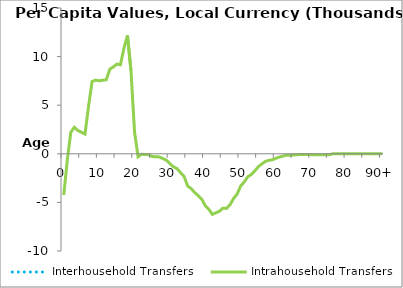
| Category | Interhousehold Transfers | Intrahousehold Transfers |
|---|---|---|
| 0 |  | -4239.979 |
|  |  | -607.498 |
| 2 |  | 2231.516 |
| 3 |  | 2722.132 |
| 4 |  | 2388.76 |
| 5 |  | 2217.637 |
| 6 |  | 2031.07 |
| 7 |  | 4879.332 |
| 8 |  | 7437.757 |
| 9 |  | 7578.179 |
| 10 |  | 7508.614 |
| 11 |  | 7571.453 |
| 12 |  | 7609.91 |
| 13 |  | 8699.473 |
| 14 |  | 8939.664 |
| 15 |  | 9228.735 |
| 16 |  | 9155.449 |
| 17 |  | 10843.579 |
| 18 |  | 12181.636 |
| 19 |  | 8522.932 |
| 20 |  | 2247.184 |
| 21 |  | -307.152 |
| 22 |  | -49.103 |
| 23 |  | -69.837 |
| 24 |  | -89.019 |
| 25 |  | -282.686 |
| 26 |  | -304.607 |
| 27 |  | -322.529 |
| 28 |  | -483.698 |
| 29 |  | -660.584 |
| 30 |  | -1011.411 |
| 31 |  | -1343.657 |
| 32 |  | -1518.196 |
| 33 |  | -1941.803 |
| 34 |  | -2330.431 |
| 35 |  | -3304.804 |
| 36 |  | -3585.433 |
| 37 |  | -3982.023 |
| 38 |  | -4318.129 |
| 39 |  | -4665.519 |
| 40 |  | -5347.568 |
| 41 |  | -5711.91 |
| 42 |  | -6231.482 |
| 43 |  | -6070.193 |
| 44 |  | -5902.119 |
| 45 |  | -5587.217 |
| 46 |  | -5617.749 |
| 47 |  | -5233.754 |
| 48 |  | -4595.514 |
| 49 |  | -4136.864 |
| 50 |  | -3309.165 |
| 51 |  | -2894.65 |
| 52 |  | -2362.259 |
| 53 |  | -2132.283 |
| 54 |  | -1761.151 |
| 55 |  | -1318.059 |
| 56 |  | -1034.871 |
| 57 |  | -779.026 |
| 58 |  | -671.104 |
| 59 |  | -608.806 |
| 60 |  | -453.117 |
| 61 |  | -330.835 |
| 62 |  | -228.089 |
| 63 |  | -135.971 |
| 64 |  | -159.95 |
| 65 |  | -120.245 |
| 66 |  | -95 |
| 67 |  | -69.683 |
| 68 |  | -74.135 |
| 69 |  | -74.793 |
| 70 |  | -101.435 |
| 71 |  | -109.04 |
| 72 |  | -105.453 |
| 73 |  | -105.204 |
| 74 |  | -105.579 |
| 75 |  | -105.579 |
| 76 |  | 0 |
| 77 |  | 0 |
| 78 |  | 0 |
| 79 |  | 0 |
| 80 |  | 0 |
| 81 |  | 0 |
| 82 |  | 0 |
| 83 |  | 0 |
| 84 |  | 0 |
| 85 |  | 0 |
| 86 |  | 0 |
| 87 |  | 0 |
| 88 |  | 0 |
| 89 |  | 0 |
| 90+ |  | 0 |